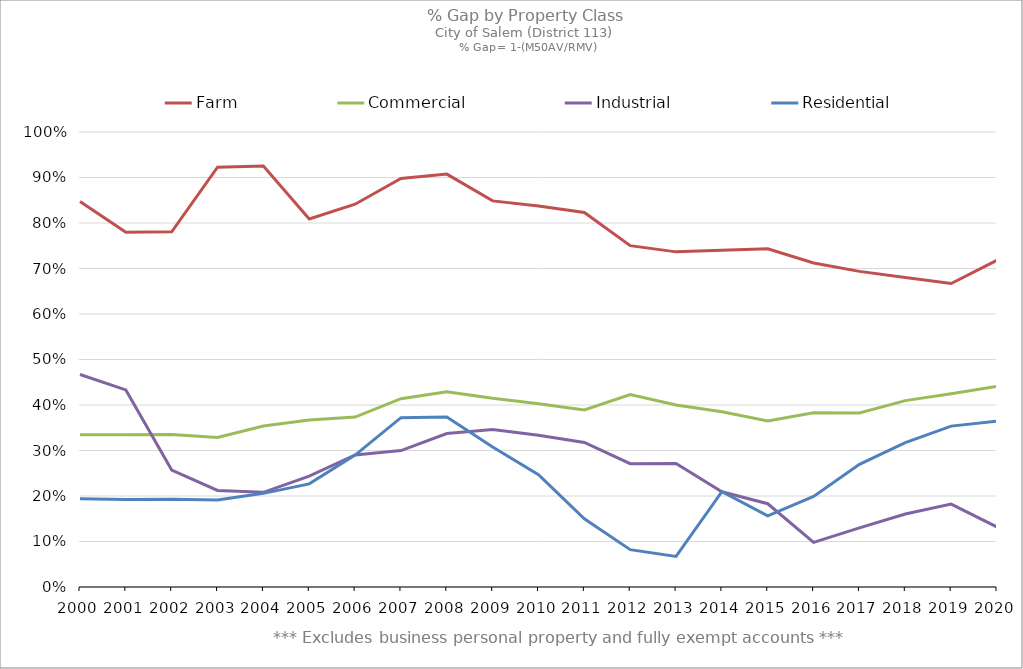
| Category | Farm | Commercial | Industrial | Residential |
|---|---|---|---|---|
| 2000.0 | 0.847 | 0.334 | 0.467 | 0.194 |
| 2001.0 | 0.78 | 0.335 | 0.433 | 0.192 |
| 2002.0 | 0.781 | 0.335 | 0.257 | 0.193 |
| 2003.0 | 0.923 | 0.329 | 0.212 | 0.191 |
| 2004.0 | 0.925 | 0.354 | 0.208 | 0.206 |
| 2005.0 | 0.809 | 0.367 | 0.244 | 0.227 |
| 2006.0 | 0.841 | 0.373 | 0.29 | 0.29 |
| 2007.0 | 0.898 | 0.414 | 0.3 | 0.372 |
| 2008.0 | 0.907 | 0.429 | 0.337 | 0.374 |
| 2009.0 | 0.849 | 0.415 | 0.346 | 0.308 |
| 2010.0 | 0.838 | 0.403 | 0.334 | 0.247 |
| 2011.0 | 0.823 | 0.389 | 0.318 | 0.15 |
| 2012.0 | 0.75 | 0.423 | 0.271 | 0.082 |
| 2013.0 | 0.737 | 0.4 | 0.271 | 0.067 |
| 2014.0 | 0.74 | 0.385 | 0.209 | 0.209 |
| 2015.0 | 0.743 | 0.365 | 0.183 | 0.156 |
| 2016.0 | 0.712 | 0.383 | 0.098 | 0.199 |
| 2017.0 | 0.694 | 0.382 | 0.13 | 0.27 |
| 2018.0 | 0.68 | 0.41 | 0.16 | 0.317 |
| 2019.0 | 0.667 | 0.425 | 0.182 | 0.354 |
| 2020.0 | 0.718 | 0.441 | 0.132 | 0.365 |